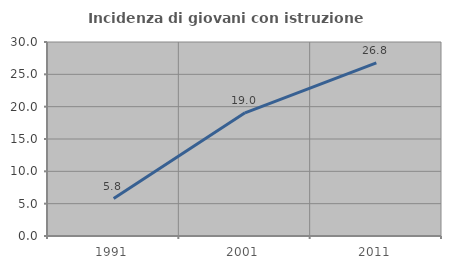
| Category | Incidenza di giovani con istruzione universitaria |
|---|---|
| 1991.0 | 5.797 |
| 2001.0 | 19.048 |
| 2011.0 | 26.786 |